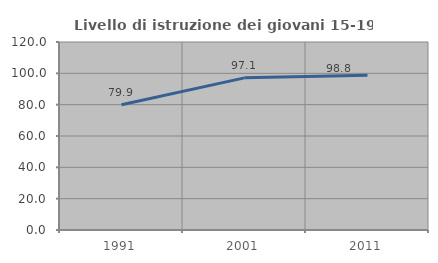
| Category | Livello di istruzione dei giovani 15-19 anni |
|---|---|
| 1991.0 | 79.914 |
| 2001.0 | 97.108 |
| 2011.0 | 98.758 |